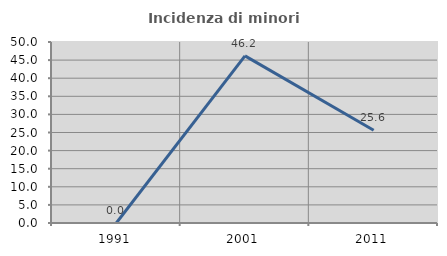
| Category | Incidenza di minori stranieri |
|---|---|
| 1991.0 | 0 |
| 2001.0 | 46.154 |
| 2011.0 | 25.641 |